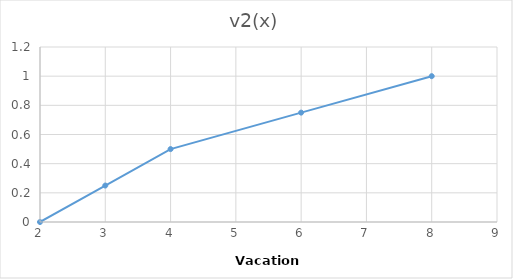
| Category | v2(x) |
|---|---|
| 2.0 | 0 |
| 3.0 | 0.25 |
| 4.0 | 0.5 |
| 6.0 | 0.75 |
| 8.0 | 1 |